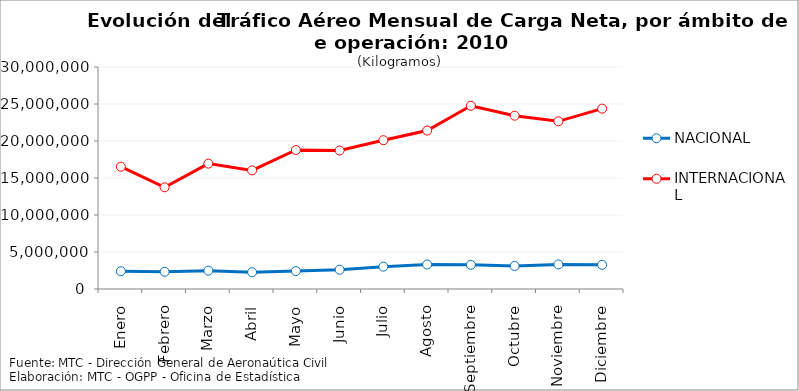
| Category | NACIONAL | INTERNACIONAL |
|---|---|---|
| Enero | 2402348 | 16528415 |
| Febrero | 2325118 | 13743602 |
| Marzo | 2482414 | 16941776 |
| Abril | 2265689 | 16028781 |
| Mayo | 2418333 | 18782834 |
| Junio | 2602078 | 18716128 |
| Julio | 3021316 | 20107846 |
| Agosto | 3313620 | 21409692 |
| Septiembre | 3263946 | 24762342 |
| Octubre | 3112409 | 23420371 |
| Noviembre | 3318541 | 22657737 |
| Diciembre | 3265351 | 24376273 |